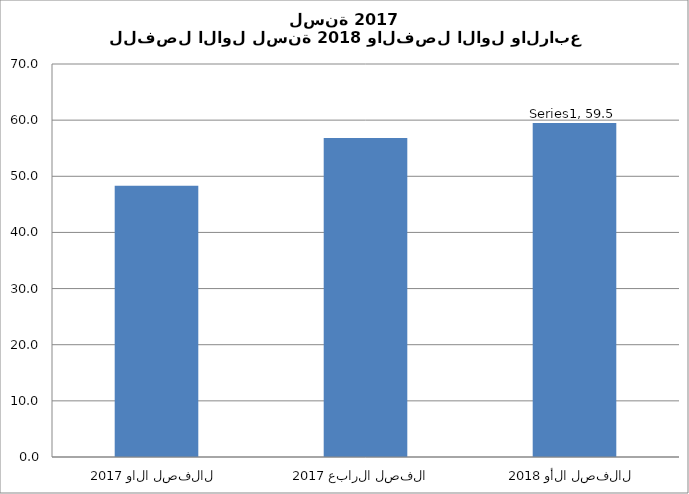
| Category | Series 0 |
|---|---|
| 2017 الفصل الاول  | 48.3 |
| 2017 الفصل الرابع  | 56.8 |
| 2018 الفصل الأول  | 59.5 |